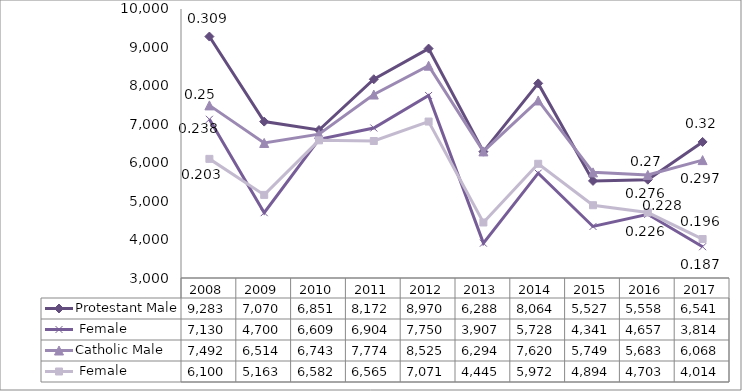
| Category | Protestant | Catholic |
|---|---|---|
| 2008.0 | 7130 | 6100 |
| 2009.0 | 4700 | 5163 |
| 2010.0 | 6609 | 6582 |
| 2011.0 | 6904 | 6565 |
| 2012.0 | 7750 | 7071 |
| 2013.0 | 3907 | 4445 |
| 2014.0 | 5728 | 5972 |
| 2015.0 | 4341 | 4894 |
| 2016.0 | 4657 | 4703 |
| 2017.0 | 3814 | 4014 |